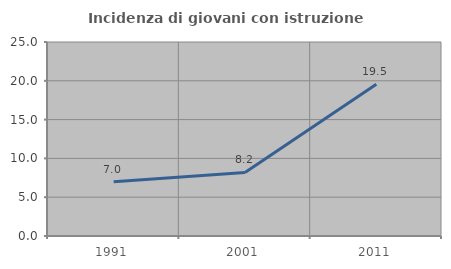
| Category | Incidenza di giovani con istruzione universitaria |
|---|---|
| 1991.0 | 6.977 |
| 2001.0 | 8.191 |
| 2011.0 | 19.549 |